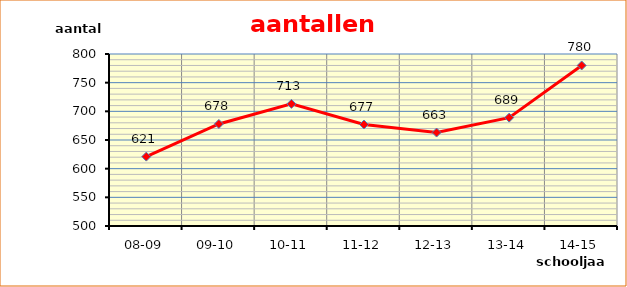
| Category | Series 0 |
|---|---|
| 08-09 | 621 |
| 09-10 | 678 |
| 10-11 | 713 |
| 11-12 | 677 |
| 12-13 | 663 |
| 13-14 | 689 |
| 14-15 | 780 |